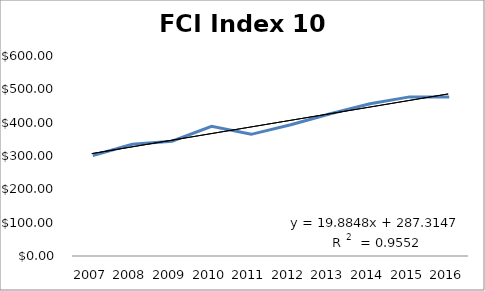
| Category | Series 0 |
|---|---|
| 2007.0 | 301.49 |
| 2008.0 | 335 |
| 2009.0 | 344.5 |
| 2010.0 | 389 |
| 2011.0 | 365 |
| 2012.0 | 393.98 |
| 2013.0 | 426.6 |
| 2014.0 | 456.6 |
| 2015.0 | 477.32 |
| 2016.0 | 477.32 |